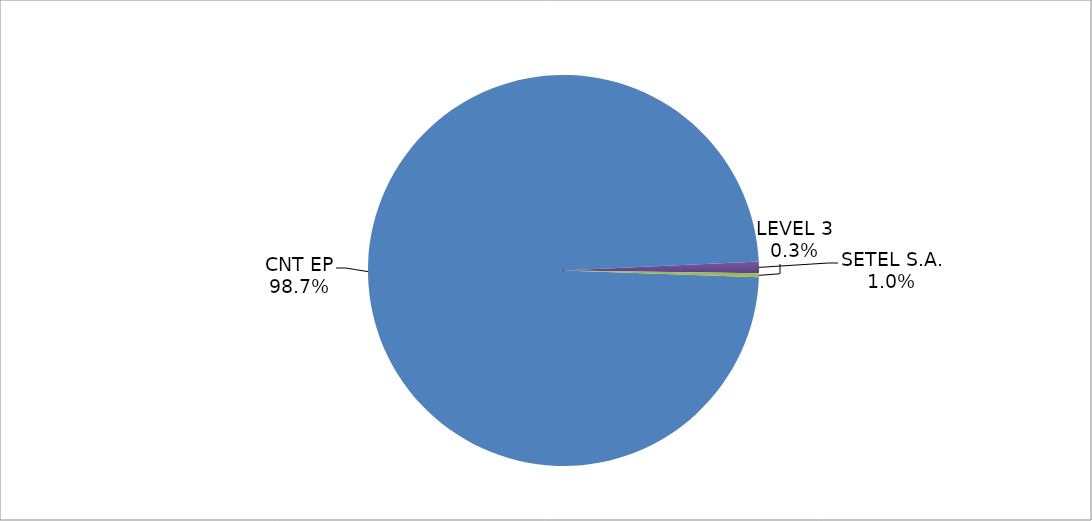
| Category | Series 0 |
|---|---|
| CNT EP | 305 |
| SETEL S.A. | 3 |
| LEVEL 3 | 1 |